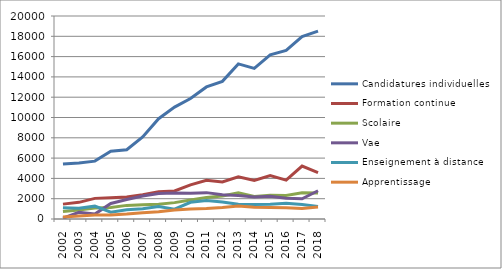
| Category | Candidatures individuelles | Formation continue | Scolaire | Vae | Enseignement à distance | Apprentissage |
|---|---|---|---|---|---|---|
| 2002 | 5415 | 1465 | 735 | 76 | 1106 | 198 |
| 2003 | 5525 | 1642 | 880 | 654 | 1049 | 284 |
| 2004 | 5700 | 2032 | 1086 | 483 | 1267 | 388 |
| 2005 | 6674 | 2087 | 1125 | 1530 | 670 | 388 |
| 2006 | 6820 | 2166 | 1341 | 1925 | 920 | 484 |
| 2007 | 8079 | 2391 | 1412 | 2259 | 1008 | 620 |
| 2008 | 9883 | 2676 | 1446 | 2501 | 1223 | 726 |
| 2009 | 11028 | 2760 | 1612 | 2570 | 961 | 884 |
| 2010 | 11868 | 3359 | 1880 | 2543 | 1645 | 993 |
| 2011 | 13010 | 3817 | 2119 | 2598 | 1821 | 1041 |
| 2012 | 13561 | 3653 | 2269 | 2399 | 1681 | 1135 |
| 2013 | 15279 | 4154 | 2571 | 2313 | 1463 | 1291 |
| 2014 | 14845 | 3803 | 2229 | 2168 | 1436 | 1159 |
| 2015 | 16171 | 4271 | 2349 | 2251 | 1455 | 1143 |
| 2016 | 16601 | 3834 | 2316 | 2043 | 1542 | 1115 |
| 2017 | 17970 | 5214 | 2591 | 1988 | 1419 | 1036 |
| 2018 | 18503 | 4570 | 2570 | 2782 | 1244 | 1186 |